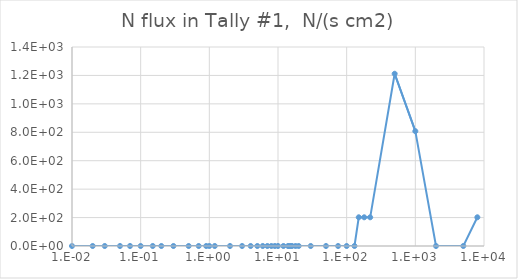
| Category | Series 0 |
|---|---|
| 1e-09 | 0 |
| 1e-08 | 0 |
| 2.5e-08 | 0 |
| 1e-07 | 0 |
| 2e-07 | 0 |
| 5e-07 | 0 |
| 1e-06 | 0 |
| 2e-06 | 0 |
| 5e-06 | 0 |
| 1e-05 | 0 |
| 2e-05 | 0 |
| 5e-05 | 0 |
| 0.0001 | 0 |
| 0.0002 | 0 |
| 0.0005 | 0 |
| 0.001 | 0 |
| 0.002 | 0 |
| 0.005 | 0 |
| 0.01 | 0 |
| 0.02 | 0 |
| 0.03 | 0 |
| 0.05 | 0 |
| 0.07 | 0 |
| 0.1 | 0 |
| 0.15 | 0 |
| 0.2 | 0 |
| 0.3 | 0 |
| 0.5 | 0 |
| 0.7 | 0 |
| 0.9 | 0 |
| 1.0 | 0 |
| 1.2 | 0 |
| 2.0 | 0 |
| 3.0 | 0 |
| 4.0 | 0 |
| 5.0 | 0 |
| 6.0 | 0 |
| 7.0 | 0 |
| 8.0 | 0 |
| 9.0 | 0 |
| 10.0 | 0 |
| 12.0 | 0 |
| 14.0 | 0 |
| 15.0 | 0 |
| 16.0 | 0 |
| 18.0 | 0 |
| 20.0 | 0 |
| 30.0 | 0 |
| 50.0 | 0 |
| 75.0 | 0 |
| 100.0 | 0 |
| 130.0 | 0 |
| 150.0 | 201.958 |
| 180.0 | 201.958 |
| 220.0 | 201.957 |
| 500.0 | 1211.75 |
| 1000.0 | 807.83 |
| 2000.0 | 0 |
| 5000.0 | 0 |
| 8000.0 | 201.958 |